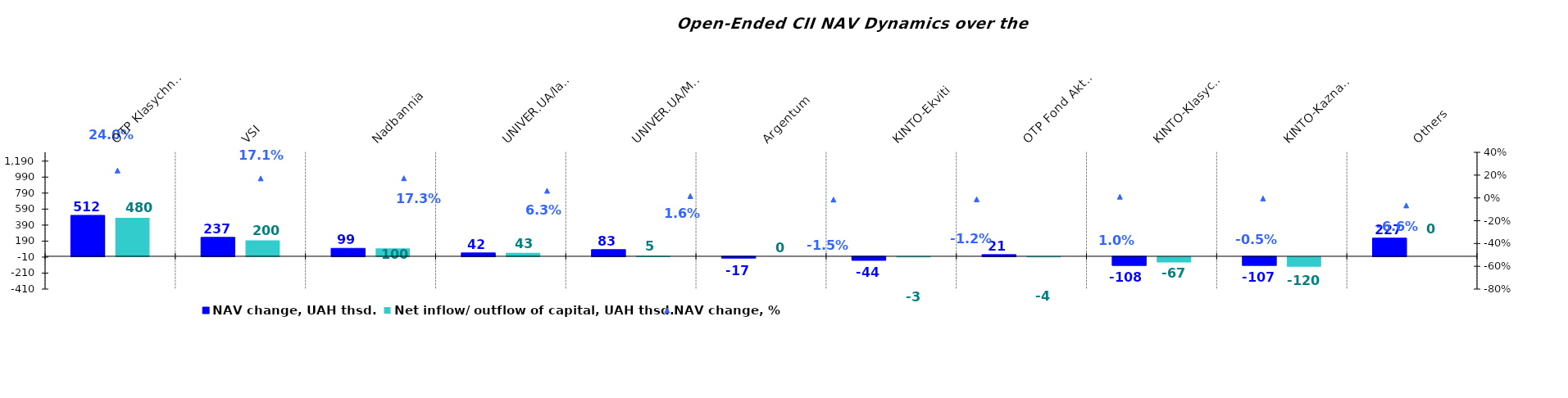
| Category | NAV change, UAH thsd. | Net inflow/ outflow of capital, UAH thsd. |
|---|---|---|
| ОТP Klasychnyi | 511.763 | 479.73 |
| VSI | 236.834 | 200.147 |
| Nadbannia | 99.313 | 99.939 |
| UNIVER.UA/Iaroslav Mudryi: Fond Aktsii | 41.964 | 43.305 |
| UNIVER.UA/Myhailo Hrushevskyi: Fond Derzhavnykh Paperiv    | 83.454 | 5.065 |
| Аrgentum | -16.518 | 0 |
| KINTO-Ekviti | -43.569 | -3.041 |
| ОТP Fond Aktsii | 21.338 | -3.504 |
| KINTO-Klasychnyi | -108.046 | -67.362 |
| KINTO-Kaznacheyskyi | -107.347 | -120.07 |
| Others | 227.075 | 0 |